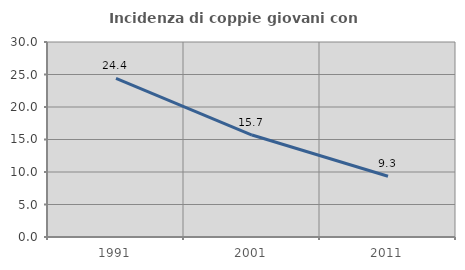
| Category | Incidenza di coppie giovani con figli |
|---|---|
| 1991.0 | 24.415 |
| 2001.0 | 15.683 |
| 2011.0 | 9.344 |